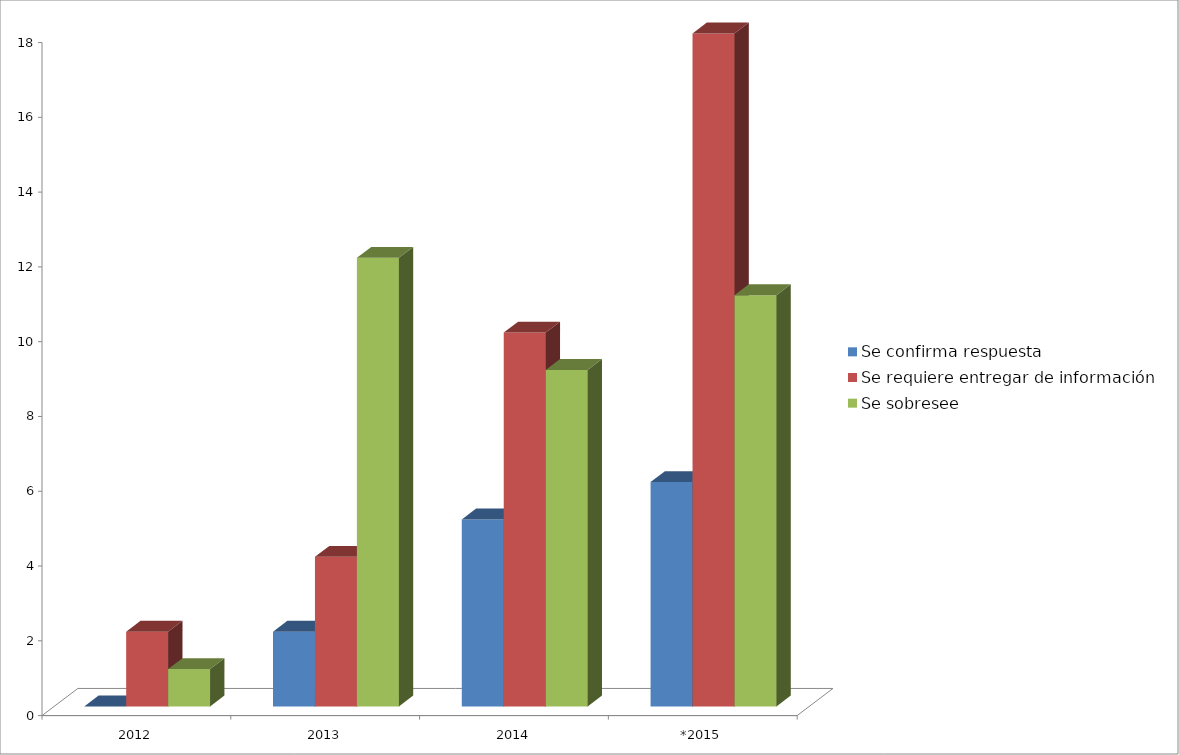
| Category | Se confirma respuesta | Se requiere entregar de información  | Se sobresee  |
|---|---|---|---|
| 2012 | 0 | 2 | 1 |
| 2013 | 2 | 4 | 12 |
| 2014 | 5 | 10 | 9 |
| *2015 | 6 | 18 | 11 |